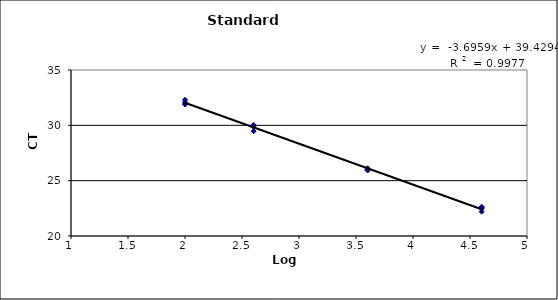
| Category | CT |
|---|---|
| 4.6020599913279625 | 22.64 |
| 3.6020599913279625 | 26.05 |
| 2.6020599913279625 | 29.47 |
| 2.0 | 31.89 |
| 4.6020599913279625 | 22.58 |
| 3.6020599913279625 | 26.01 |
| 2.6020599913279625 | 29.99 |
| 2.0 | 32.1 |
| 4.6020599913279625 | 22.2 |
| 3.6020599913279625 | 26.12 |
| 2.6020599913279625 | 30.02 |
| 2.0 | 31.93 |
| 4.6020599913279625 | 22.47 |
| 3.6020599913279625 | 25.92 |
| 2.6020599913279625 | 29.85 |
| 2.0 | 32.31 |